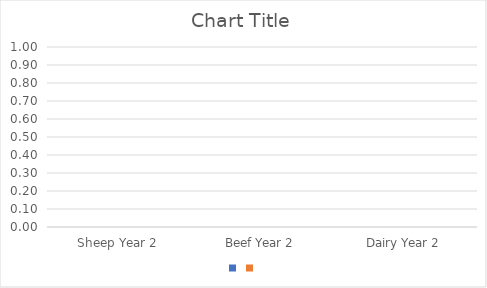
| Category | Series 0 | Series 1 |
|---|---|---|
| Sheep Year 2 | 0 | 0 |
| Beef Year 2 | 0 | 0 |
| Dairy Year 2 | 0 | 0 |